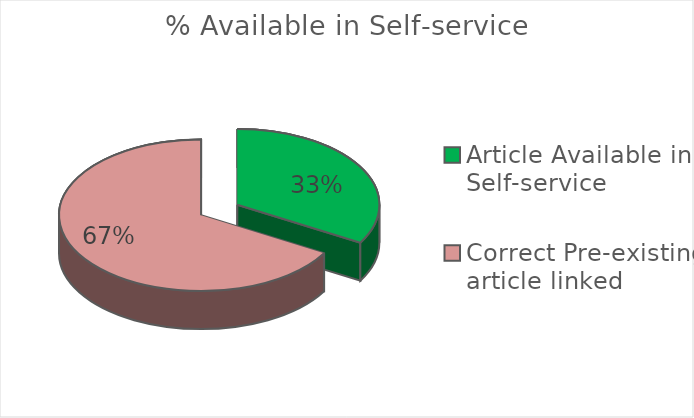
| Category | Series 0 |
|---|---|
| Article Available in Self-service | 3 |
| Correct Pre-existing article linked | 6 |